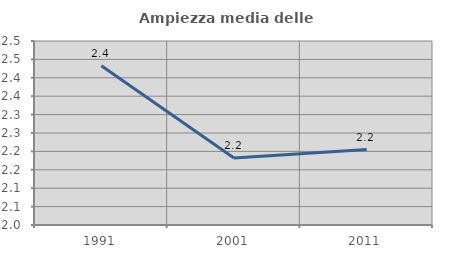
| Category | Ampiezza media delle famiglie |
|---|---|
| 1991.0 | 2.433 |
| 2001.0 | 2.182 |
| 2011.0 | 2.205 |